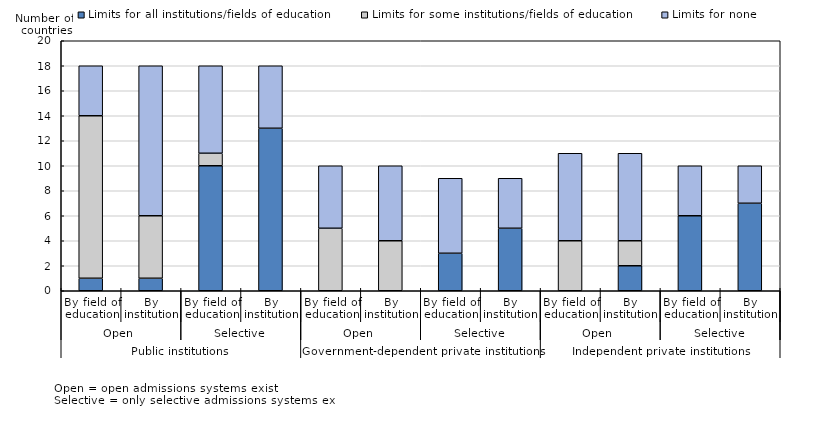
| Category | Limits for all institutions/fields of education | Limits for some institutions/fields of education | Limits for none |
|---|---|---|---|
| 0 | 1 | 13 | 4 |
| 1 | 1 | 5 | 12 |
| 2 | 10 | 1 | 7 |
| 3 | 13 | 0 | 5 |
| 4 | 0 | 5 | 5 |
| 5 | 0 | 4 | 6 |
| 6 | 3 | 0 | 6 |
| 7 | 5 | 0 | 4 |
| 8 | 0 | 4 | 7 |
| 9 | 2 | 2 | 7 |
| 10 | 6 | 0 | 4 |
| 11 | 7 | 0 | 3 |